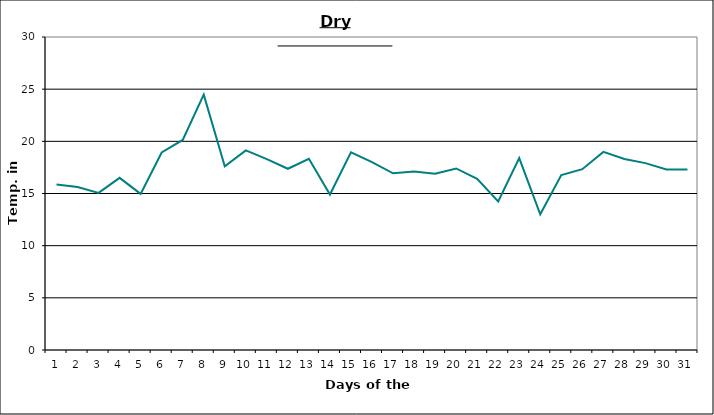
| Category | Series 0 |
|---|---|
| 0 | 15.87 |
| 1 | 15.62 |
| 2 | 15.06 |
| 3 | 16.5 |
| 4 | 14.96 |
| 5 | 18.93 |
| 6 | 20.13 |
| 7 | 24.47 |
| 8 | 17.6 |
| 9 | 19.13 |
| 10 | 18.29 |
| 11 | 17.37 |
| 12 | 18.32 |
| 13 | 14.9 |
| 14 | 18.94 |
| 15 | 18.01 |
| 16 | 16.94 |
| 17 | 17.1 |
| 18 | 16.9 |
| 19 | 17.4 |
| 20 | 16.4 |
| 21 | 14.23 |
| 22 | 18.39 |
| 23 | 13.01 |
| 24 | 16.76 |
| 25 | 17.33 |
| 26 | 18.99 |
| 27 | 18.3 |
| 28 | 17.91 |
| 29 | 17.3 |
| 30 | 17.3 |